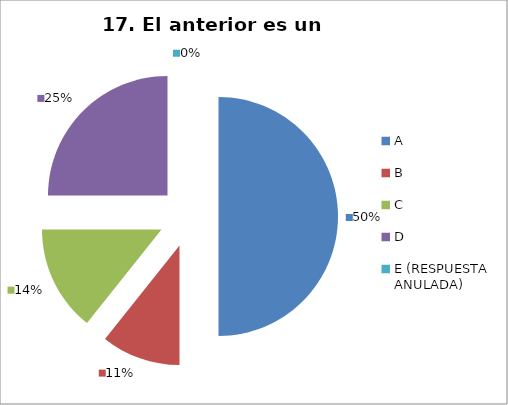
| Category | CANTIDAD DE RESPUESTAS PREGUNTA (17) | PORCENTAJE |
|---|---|---|
| A | 14 | 0.5 |
| B | 3 | 0.107 |
| C | 4 | 0.143 |
| D | 7 | 0.25 |
| E (RESPUESTA ANULADA) | 0 | 0 |